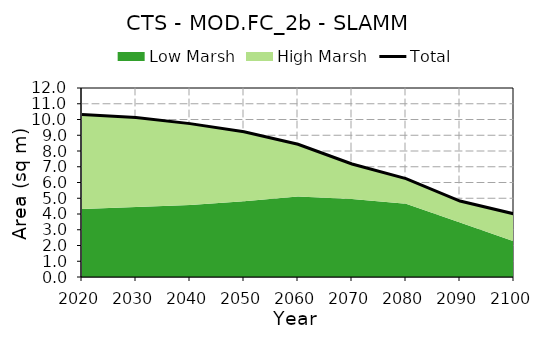
| Category | Total |
|---|---|
| 0 | 10.312 |
| 1 | 10.131 |
| 2 | 9.738 |
| 3 | 9.222 |
| 4 | 8.428 |
| 5 | 7.173 |
| 6 | 6.246 |
| 7 | 4.824 |
| 8 | 4.01 |